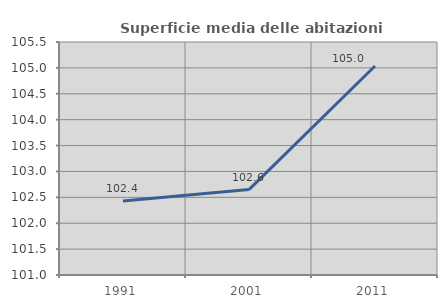
| Category | Superficie media delle abitazioni occupate |
|---|---|
| 1991.0 | 102.428 |
| 2001.0 | 102.65 |
| 2011.0 | 105.036 |